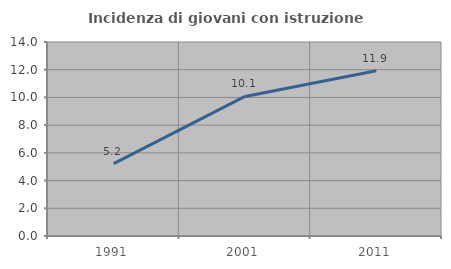
| Category | Incidenza di giovani con istruzione universitaria |
|---|---|
| 1991.0 | 5.224 |
| 2001.0 | 10.072 |
| 2011.0 | 11.932 |